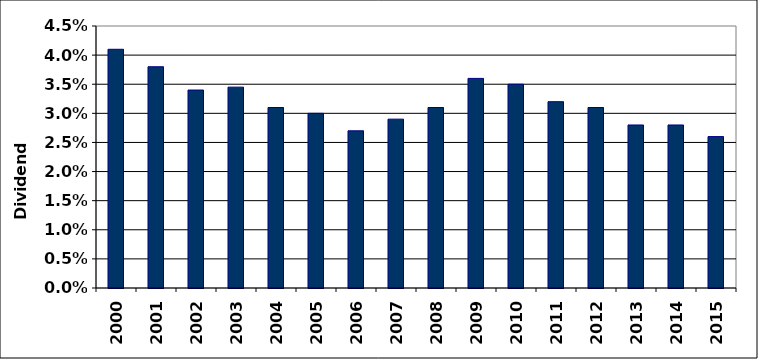
| Category | Series 0 |
|---|---|
| 2000.0 | 0.041 |
| 2001.0 | 0.038 |
| 2002.0 | 0.034 |
| 2003.0 | 0.034 |
| 2004.0 | 0.031 |
| 2005.0 | 0.03 |
| 2006.0 | 0.027 |
| 2007.0 | 0.029 |
| 2008.0 | 0.031 |
| 2009.0 | 0.036 |
| 2010.0 | 0.035 |
| 2011.0 | 0.032 |
| 2012.0 | 0.031 |
| 2013.0 | 0.028 |
| 2014.0 | 0.028 |
| 2015.0 | 0.026 |